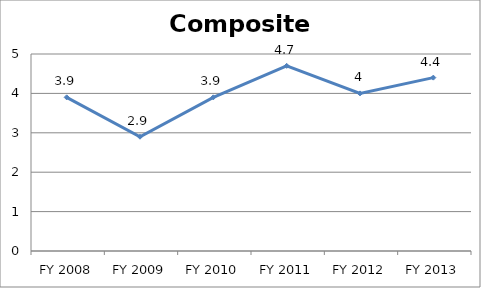
| Category | Composite score |
|---|---|
| FY 2013 | 4.4 |
| FY 2012 | 4 |
| FY 2011 | 4.7 |
| FY 2010 | 3.9 |
| FY 2009 | 2.9 |
| FY 2008 | 3.9 |